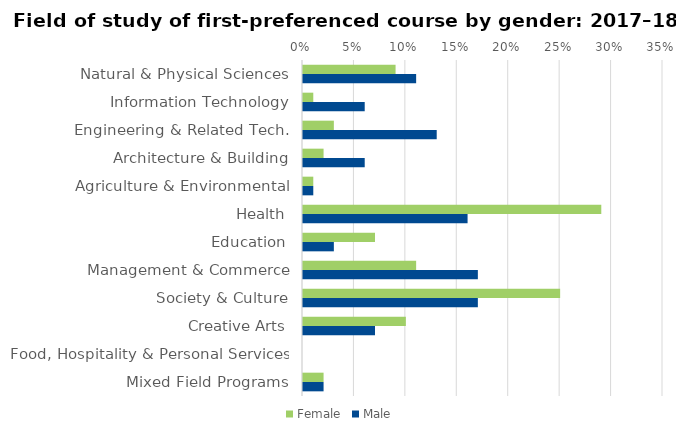
| Category | Female | Male |
|---|---|---|
| Natural & Physical Sciences | 0.09 | 0.11 |
| Information Technology | 0.01 | 0.06 |
| Engineering & Related Tech. | 0.03 | 0.13 |
| Architecture & Building | 0.02 | 0.06 |
| Agriculture & Environmental | 0.01 | 0.01 |
| Health | 0.29 | 0.16 |
| Education | 0.07 | 0.03 |
| Management & Commerce | 0.11 | 0.17 |
| Society & Culture | 0.25 | 0.17 |
| Creative Arts | 0.1 | 0.07 |
| Food, Hospitality & Personal Services | 0 | 0 |
| Mixed Field Programs | 0.02 | 0.02 |